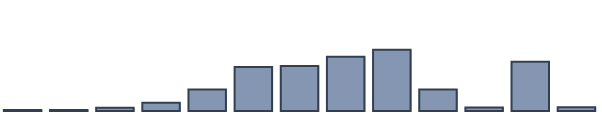
| Category | Series 0 |
|---|---|
| 0 | 0.3 |
| 1 | 0.3 |
| 2 | 1 |
| 3 | 2.6 |
| 4 | 6.8 |
| 5 | 13.9 |
| 6 | 14.2 |
| 7 | 17.1 |
| 8 | 19.3 |
| 9 | 6.8 |
| 10 | 1.1 |
| 11 | 15.5 |
| 12 | 1.2 |